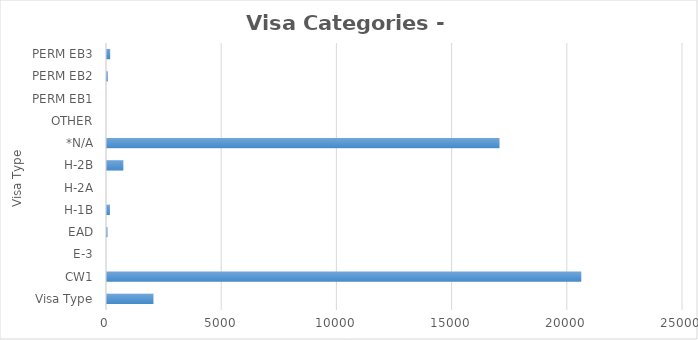
| Category | Series 0 |
|---|---|
| Visa Type | 2016 |
| CW1 | 20585 |
| E-3 | 0 |
| EAD | 23 |
| H-1B | 126 |
| H-2A | 0 |
| H-2B | 709 |
| *N/A | 17036 |
| OTHER | 0 |
| PERM EB1 | 0 |
| PERM EB2 | 35 |
| PERM EB3 | 138 |